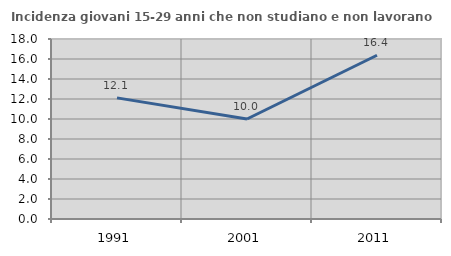
| Category | Incidenza giovani 15-29 anni che non studiano e non lavorano  |
|---|---|
| 1991.0 | 12.113 |
| 2001.0 | 10 |
| 2011.0 | 16.376 |